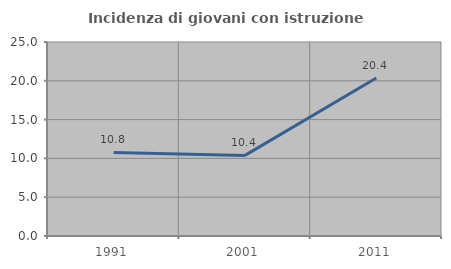
| Category | Incidenza di giovani con istruzione universitaria |
|---|---|
| 1991.0 | 10.769 |
| 2001.0 | 10.39 |
| 2011.0 | 20.37 |